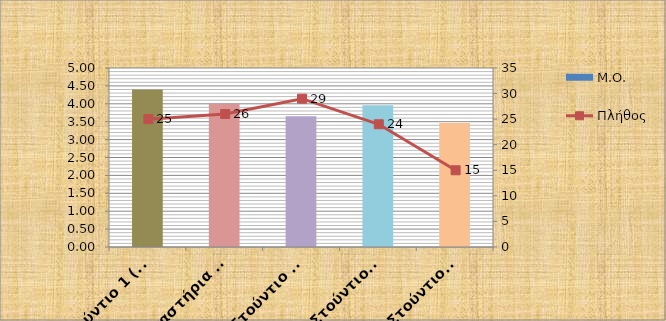
| Category | Μ.Ο. |
|---|---|
| Στούντιο 1 (Σχέδιο Χρώμα) | 4.4 |
| Εργαστήρια Ελεύθερου Σχεδίου 1 | 4 |
| Στούντιο 3  | 3.655 |
| Στούντιο 5 | 3.958 |
| Στούντιο 7 | 3.467 |